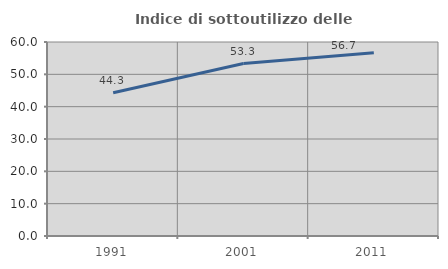
| Category | Indice di sottoutilizzo delle abitazioni  |
|---|---|
| 1991.0 | 44.292 |
| 2001.0 | 53.333 |
| 2011.0 | 56.667 |